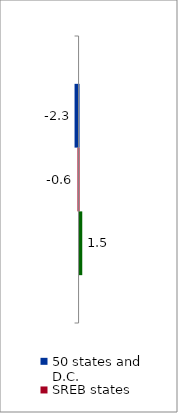
| Category | 50 states and D.C. | SREB states | State |
|---|---|---|---|
| 2012 to 2017 | -2.27 | -0.622 | 1.515 |